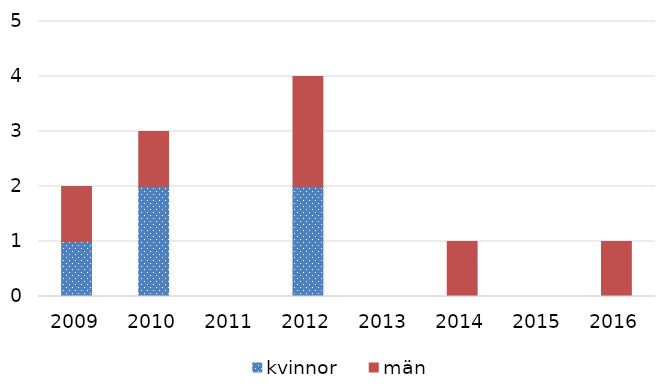
| Category | kvinnor | män |
|---|---|---|
| 2009 | 1 | 1 |
| 2010 | 2 | 1 |
| 2011 | 0 | 0 |
| 2012 | 2 | 2 |
| 2013 | 0 | 0 |
| 2014 | 0 | 1 |
| 2015 | 0 | 0 |
| 2016 | 0 | 1 |